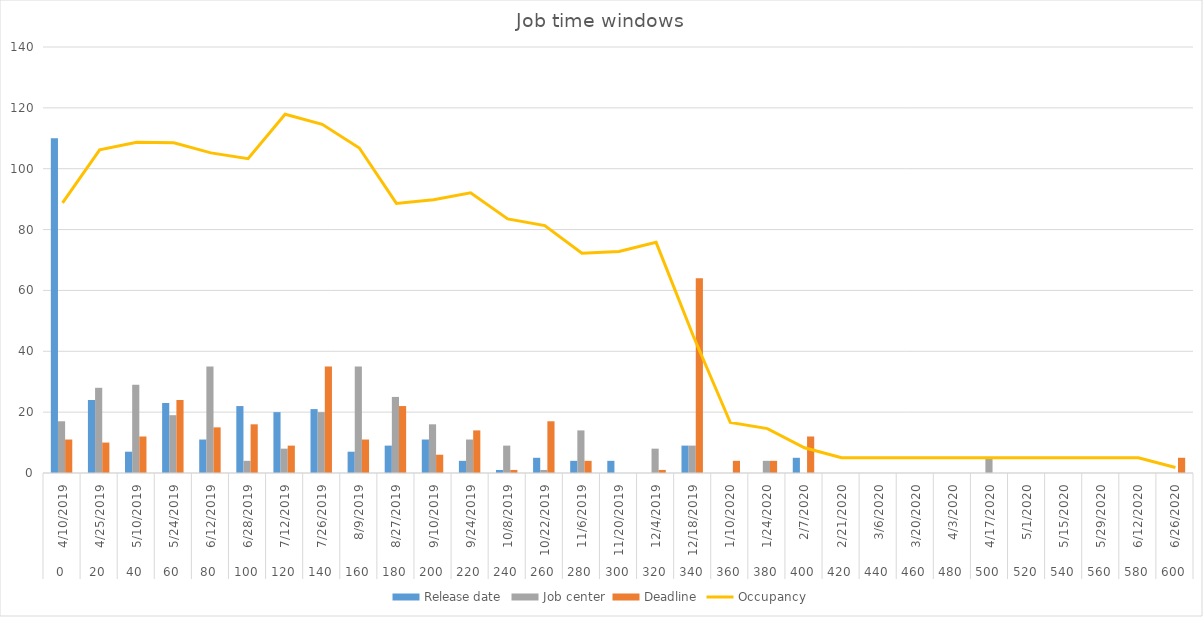
| Category | Release date | Job center | Deadline |
|---|---|---|---|
| 0 | 110 | 17 | 11 |
| 1 | 24 | 28 | 10 |
| 2 | 7 | 29 | 12 |
| 3 | 23 | 19 | 24 |
| 4 | 11 | 35 | 15 |
| 5 | 22 | 4 | 16 |
| 6 | 20 | 8 | 9 |
| 7 | 21 | 20 | 35 |
| 8 | 7 | 35 | 11 |
| 9 | 9 | 25 | 22 |
| 10 | 11 | 16 | 6 |
| 11 | 4 | 11 | 14 |
| 12 | 1 | 9 | 1 |
| 13 | 5 | 1 | 17 |
| 14 | 4 | 14 | 4 |
| 15 | 4 | 0 | 0 |
| 16 | 0 | 8 | 1 |
| 17 | 9 | 9 | 64 |
| 18 | 0 | 0 | 4 |
| 19 | 0 | 4 | 4 |
| 20 | 5 | 0 | 12 |
| 21 | 0 | 0 | 0 |
| 22 | 0 | 0 | 0 |
| 23 | 0 | 0 | 0 |
| 24 | 0 | 0 | 0 |
| 25 | 0 | 5 | 0 |
| 26 | 0 | 0 | 0 |
| 27 | 0 | 0 | 0 |
| 28 | 0 | 0 | 0 |
| 29 | 0 | 0 | 0 |
| 30 | 0 | 0 | 5 |